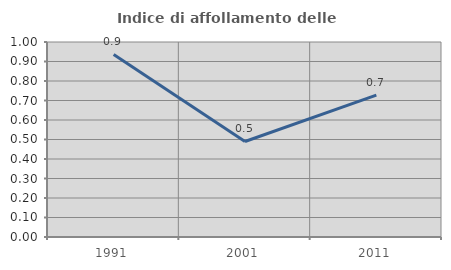
| Category | Indice di affollamento delle abitazioni  |
|---|---|
| 1991.0 | 0.936 |
| 2001.0 | 0.49 |
| 2011.0 | 0.728 |